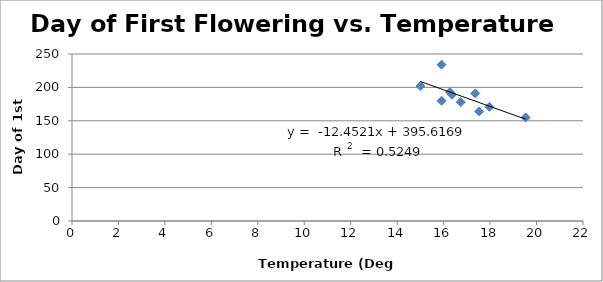
| Category | Series 0 |
|---|---|
| 15.91 | 180 |
| 15.91 | 234 |
| 16.27 | 193 |
| 16.74 | 178 |
| 16.36 | 189 |
| 15.0 | 202 |
| 17.53 | 164 |
| 17.97 | 171 |
| 17.36 | 191 |
| 19.53 | 155 |